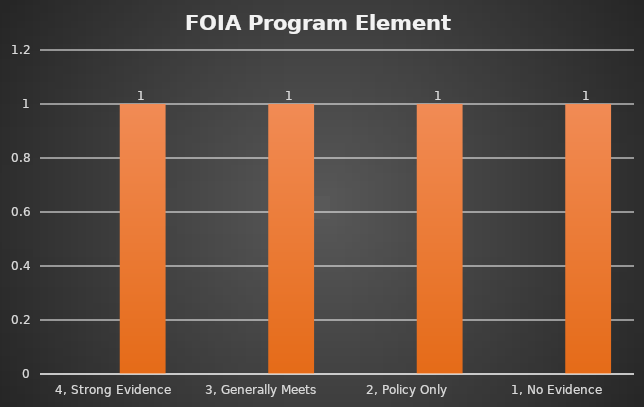
| Category | Series 0 | Series 1 |
|---|---|---|
| 4, Strong Evidence |  | 1 |
| 3, Generally Meets |  | 1 |
| 2, Policy Only  |  | 1 |
| 1, No Evidence  |  | 1 |